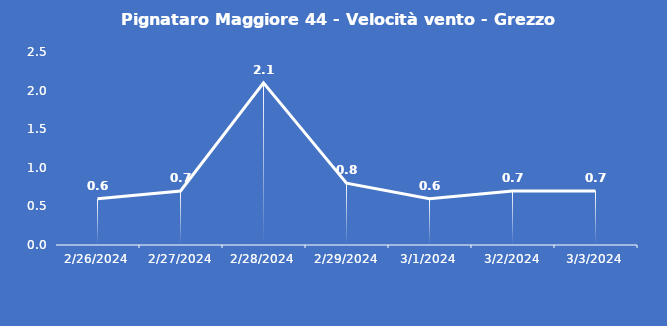
| Category | Pignataro Maggiore 44 - Velocità vento - Grezzo (m/s) |
|---|---|
| 2/26/24 | 0.6 |
| 2/27/24 | 0.7 |
| 2/28/24 | 2.1 |
| 2/29/24 | 0.8 |
| 3/1/24 | 0.6 |
| 3/2/24 | 0.7 |
| 3/3/24 | 0.7 |